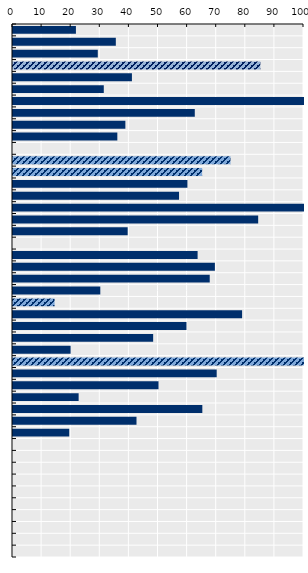
| Category | Payment rate (%) |
|---|---|
| Finland | 21.624 |
| Hungary | 35.335 |
| Slovak Republic | 29.138 |
| Romania | 85 |
| Latvia | 40.865 |
| Norway | 31.199 |
| Estonia | 100 |
| Lithuania | 62.47 |
| Korea | 38.615 |
| Bulgaria | 35.853 |
| EU average | 0 |
| Austria | 74.734 |
| Germany | 65 |
| Japan | 59.935 |
| Sweden | 57.056 |
| Slovenia | 100 |
| Czechia | 84.255 |
| Canada | 39.408 |
| OECD average | 0 |
| Poland | 63.437 |
| Luxembourg | 69.379 |
| Croatia | 67.604 |
| Italy | 30 |
| France | 14.291 |
| Greece | 78.728 |
| Portugal | 59.611 |
| Denmark | 48.162 |
| Belgium | 19.798 |
| Chile | 100 |
| Netherlands | 70 |
| Malta | 50 |
| Ireland | 22.556 |
| Iceland | 65.061 |
| Australia | 42.439 |
| Cyprus | 19.334 |
| United Kingdom | 0 |
| New Zealand | 0 |
| Costa Rica | 0 |
| Spain | 0 |
| Türkiye | 0 |
| Israel | 0 |
| Switzerland | 0 |
| Mexico | 0 |
| United States | 0 |
| Colombia | 0 |